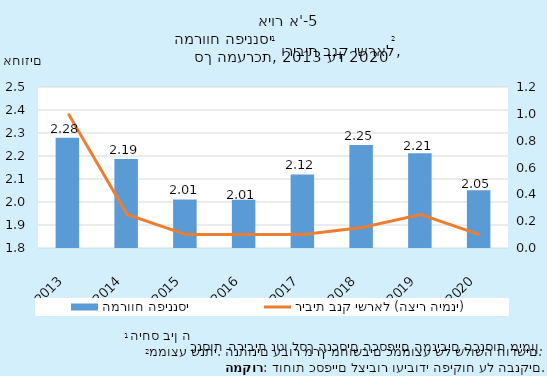
| Category | המרווח הפיננסי |
|---|---|
| 2013-12-31 | 2.279 |
| 2014-12-31 | 2.187 |
| 2015-12-31 | 2.011 |
| 2016-12-31 | 2.01 |
| 2017-12-31 | 2.12 |
| 2018-12-31 | 2.248 |
| 2019-12-31 | 2.212 |
| 2020-12-31 | 2.051 |